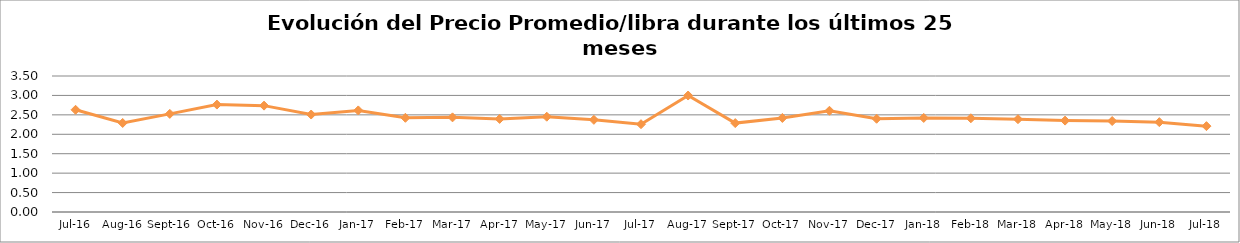
| Category | Series 0 |
|---|---|
| 2016-07-01 | 2.631 |
| 2016-08-01 | 2.292 |
| 2016-09-01 | 2.525 |
| 2016-10-01 | 2.764 |
| 2016-11-01 | 2.737 |
| 2016-12-01 | 2.508 |
| 2017-01-01 | 2.615 |
| 2017-02-01 | 2.424 |
| 2017-03-01 | 2.436 |
| 2017-04-01 | 2.396 |
| 2017-05-01 | 2.452 |
| 2017-06-01 | 2.372 |
| 2017-07-01 | 2.26 |
| 2017-08-01 | 2.997 |
| 2017-09-01 | 2.288 |
| 2017-10-01 | 2.421 |
| 2017-11-01 | 2.605 |
| 2017-12-01 | 2.4 |
| 2018-01-01 | 2.42 |
| 2018-02-01 | 2.412 |
| 2018-03-01 | 2.388 |
| 2018-04-01 | 2.352 |
| 2018-05-01 | 2.341 |
| 2018-06-01 | 2.312 |
| 2018-07-01 | 2.209 |